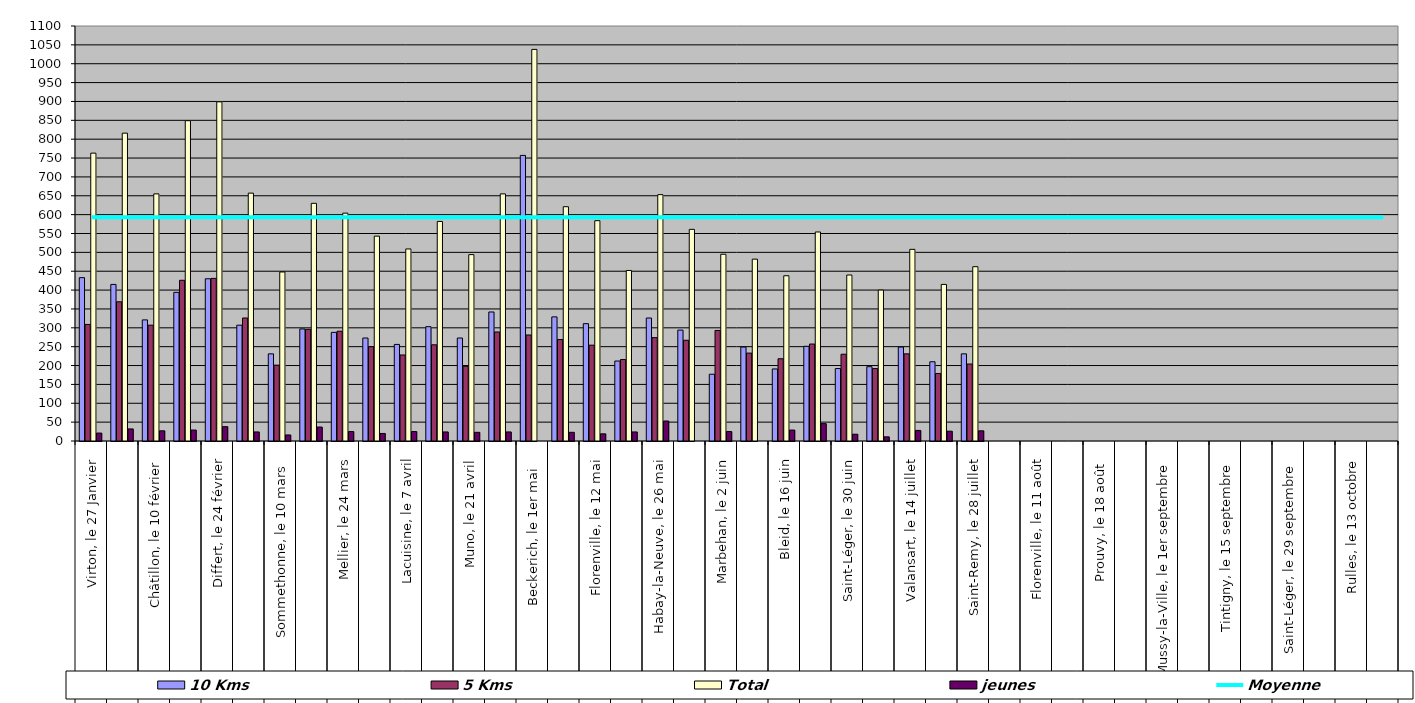
| Category | 10 Kms | 5 Kms | Total | jeunes |
|---|---|---|---|---|
| 0 | 433 | 309 | 763 | 21 |
| 1 | 415 | 369 | 816 | 32 |
| 2 | 321 | 307 | 655 | 27 |
| 3 | 394 | 426 | 849 | 29 |
| 4 | 430 | 431 | 899 | 38 |
| 5 | 307 | 326 | 657 | 24 |
| 6 | 231 | 201 | 448 | 16 |
| 7 | 297 | 296 | 630 | 37 |
| 8 | 288 | 291 | 604 | 25 |
| 9 | 273 | 250 | 543 | 20 |
| 10 | 256 | 228 | 509 | 25 |
| 11 | 303 | 255 | 582 | 24 |
| 12 | 273 | 198 | 494 | 23 |
| 13 | 342 | 289 | 655 | 24 |
| 14 | 757 | 281 | 1038 | 0 |
| 15 | 329 | 269 | 621 | 23 |
| 16 | 311 | 254 | 584 | 19 |
| 17 | 212 | 216 | 452 | 24 |
| 18 | 326 | 274 | 653 | 53 |
| 19 | 294 | 267 | 561 | 0 |
| 20 | 177 | 293 | 495 | 25 |
| 21 | 249 | 233 | 482 | 0 |
| 22 | 191 | 218 | 438 | 29 |
| 23 | 251 | 257 | 554 | 46 |
| 24 | 192 | 230 | 440 | 18 |
| 25 | 197 | 192 | 400 | 11 |
| 26 | 249 | 231 | 508 | 28 |
| 27 | 210 | 179 | 415 | 26 |
| 28 | 231 | 204 | 462 | 27 |
| 29 | 0 | 0 | 0 | 0 |
| 30 | 0 | 0 | 0 | 0 |
| 31 | 0 | 0 | 0 | 0 |
| 32 | 0 | 0 | 0 | 0 |
| 33 | 0 | 0 | 0 | 0 |
| 34 | 0 | 0 | 0 | 0 |
| 35 | 0 | 0 | 0 | 0 |
| 36 | 0 | 0 | 0 | 0 |
| 37 | 0 | 0 | 0 | 0 |
| 38 | 0 | 0 | 0 | 0 |
| 39 | 0 | 0 | 0 | 0 |
| 40 | 0 | 0 | 0 | 0 |
| 41 | 0 | 0 | 0 | 0 |